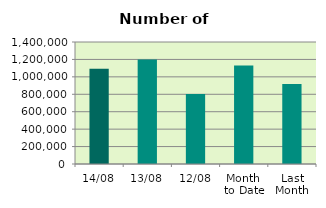
| Category | Series 0 |
|---|---|
| 14/08 | 1092886 |
| 13/08 | 1198128 |
| 12/08 | 803612 |
| Month 
to Date | 1130657.8 |
| Last
Month | 919173.478 |